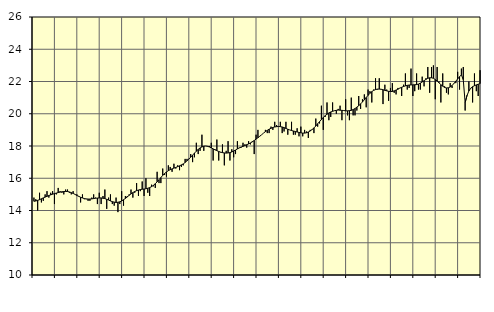
| Category | Piggar | Finansiell verksamhet, företagstjänster, SNI 64-82 |
|---|---|---|
| nan | 14.8 | 14.57 |
| 1.0 | 14.7 | 14.59 |
| 1.0 | 14 | 14.63 |
| 1.0 | 15.1 | 14.67 |
| 1.0 | 14.5 | 14.73 |
| 1.0 | 14.6 | 14.78 |
| 1.0 | 15 | 14.83 |
| 1.0 | 15.2 | 14.88 |
| 1.0 | 14.8 | 14.93 |
| 1.0 | 15.1 | 14.97 |
| 1.0 | 15.2 | 15.01 |
| 1.0 | 14.4 | 15.05 |
| nan | 15 | 15.08 |
| 2.0 | 15.4 | 15.11 |
| 2.0 | 15.2 | 15.14 |
| 2.0 | 15.1 | 15.16 |
| 2.0 | 15 | 15.18 |
| 2.0 | 15.3 | 15.18 |
| 2.0 | 15.3 | 15.18 |
| 2.0 | 15.1 | 15.15 |
| 2.0 | 15 | 15.11 |
| 2.0 | 15.2 | 15.06 |
| 2.0 | 15 | 15 |
| 2.0 | 15 | 14.93 |
| nan | 14.9 | 14.88 |
| 3.0 | 14.5 | 14.82 |
| 3.0 | 15 | 14.78 |
| 3.0 | 14.7 | 14.74 |
| 3.0 | 14.7 | 14.72 |
| 3.0 | 14.6 | 14.71 |
| 3.0 | 14.6 | 14.71 |
| 3.0 | 14.8 | 14.72 |
| 3.0 | 15 | 14.74 |
| 3.0 | 14.8 | 14.76 |
| 3.0 | 14.4 | 14.77 |
| 3.0 | 15.1 | 14.78 |
| nan | 14.4 | 14.78 |
| 4.0 | 14.9 | 14.76 |
| 4.0 | 15.3 | 14.74 |
| 4.0 | 14.1 | 14.69 |
| 4.0 | 14.8 | 14.65 |
| 4.0 | 15 | 14.59 |
| 4.0 | 14.4 | 14.55 |
| 4.0 | 14.3 | 14.52 |
| 4.0 | 14.8 | 14.5 |
| 4.0 | 13.9 | 14.51 |
| 4.0 | 14.4 | 14.54 |
| 4.0 | 15.2 | 14.59 |
| nan | 14.3 | 14.67 |
| 5.0 | 14.9 | 14.75 |
| 5.0 | 14.9 | 14.84 |
| 5.0 | 15 | 14.94 |
| 5.0 | 15.3 | 15.03 |
| 5.0 | 14.8 | 15.11 |
| 5.0 | 15.1 | 15.18 |
| 5.0 | 15.7 | 15.23 |
| 5.0 | 14.9 | 15.27 |
| 5.0 | 15.2 | 15.3 |
| 5.0 | 15.8 | 15.32 |
| 5.0 | 14.9 | 15.33 |
| nan | 16 | 15.35 |
| 6.0 | 15.1 | 15.38 |
| 6.0 | 14.9 | 15.42 |
| 6.0 | 15.6 | 15.48 |
| 6.0 | 15.5 | 15.56 |
| 6.0 | 15.4 | 15.66 |
| 6.0 | 16.4 | 15.78 |
| 6.0 | 15.7 | 15.91 |
| 6.0 | 15.7 | 16.04 |
| 6.0 | 16.6 | 16.18 |
| 6.0 | 16.2 | 16.29 |
| 6.0 | 16.1 | 16.39 |
| nan | 16.8 | 16.47 |
| 7.0 | 16.7 | 16.53 |
| 7.0 | 16.4 | 16.58 |
| 7.0 | 16.9 | 16.63 |
| 7.0 | 16.6 | 16.67 |
| 7.0 | 16.8 | 16.72 |
| 7.0 | 16.5 | 16.77 |
| 7.0 | 16.7 | 16.83 |
| 7.0 | 16.8 | 16.89 |
| 7.0 | 17.2 | 16.98 |
| 7.0 | 17.2 | 17.08 |
| 7.0 | 17.2 | 17.19 |
| nan | 17.5 | 17.31 |
| 8.0 | 17 | 17.43 |
| 8.0 | 17.3 | 17.56 |
| 8.0 | 18.2 | 17.68 |
| 8.0 | 17.5 | 17.79 |
| 8.0 | 17.7 | 17.88 |
| 8.0 | 18.7 | 17.94 |
| 8.0 | 17.7 | 17.99 |
| 8.0 | 18 | 18 |
| 8.0 | 18 | 17.98 |
| 8.0 | 18 | 17.94 |
| 8.0 | 18.2 | 17.89 |
| nan | 17.1 | 17.82 |
| 9.0 | 17.8 | 17.76 |
| 9.0 | 18.4 | 17.71 |
| 9.0 | 17.1 | 17.66 |
| 9.0 | 17.6 | 17.62 |
| 9.0 | 18.1 | 17.59 |
| 9.0 | 16.8 | 17.57 |
| 9.0 | 17.7 | 17.56 |
| 9.0 | 18.3 | 17.57 |
| 9.0 | 17.1 | 17.59 |
| 9.0 | 17.8 | 17.63 |
| 9.0 | 17.3 | 17.69 |
| nan | 17.5 | 17.75 |
| 10.0 | 18.3 | 17.82 |
| 10.0 | 17.9 | 17.88 |
| 10.0 | 17.9 | 17.93 |
| 10.0 | 18.2 | 17.98 |
| 10.0 | 18.1 | 18.03 |
| 10.0 | 17.9 | 18.08 |
| 10.0 | 18.3 | 18.13 |
| 10.0 | 18.1 | 18.19 |
| 10.0 | 18.3 | 18.26 |
| 10.0 | 17.5 | 18.34 |
| 10.0 | 18.7 | 18.43 |
| nan | 19 | 18.51 |
| 11.0 | 18.6 | 18.61 |
| 11.0 | 18.7 | 18.7 |
| 11.0 | 18.8 | 18.8 |
| 11.0 | 19 | 18.89 |
| 11.0 | 18.8 | 18.97 |
| 11.0 | 18.8 | 19.04 |
| 11.0 | 19.2 | 19.1 |
| 11.0 | 19 | 19.15 |
| 11.0 | 19.5 | 19.18 |
| 11.0 | 19.3 | 19.2 |
| 11.0 | 19.2 | 19.21 |
| nan | 19.5 | 19.2 |
| 12.0 | 18.8 | 19.18 |
| 12.0 | 18.9 | 19.14 |
| 12.0 | 19.5 | 19.09 |
| 12.0 | 18.7 | 19.04 |
| 12.0 | 19 | 19 |
| 12.0 | 19.5 | 18.96 |
| 12.0 | 18.7 | 18.93 |
| 12.0 | 18.7 | 18.9 |
| 12.0 | 19.1 | 18.87 |
| 12.0 | 18.6 | 18.84 |
| 12.0 | 19.2 | 18.82 |
| nan | 18.6 | 18.8 |
| 13.0 | 19 | 18.8 |
| 13.0 | 18.9 | 18.82 |
| 13.0 | 18.5 | 18.87 |
| 13.0 | 19 | 18.93 |
| 13.0 | 19 | 19.02 |
| 13.0 | 18.8 | 19.12 |
| 13.0 | 19.7 | 19.24 |
| 13.0 | 19.2 | 19.38 |
| 13.0 | 19.4 | 19.51 |
| 13.0 | 20.5 | 19.64 |
| 13.0 | 19 | 19.77 |
| nan | 19.8 | 19.88 |
| 14.0 | 20.7 | 19.97 |
| 14.0 | 19.6 | 20.05 |
| 14.0 | 19.8 | 20.11 |
| 14.0 | 20.7 | 20.15 |
| 14.0 | 20.2 | 20.19 |
| 14.0 | 20 | 20.21 |
| 14.0 | 20.3 | 20.23 |
| 14.0 | 20.5 | 20.22 |
| 14.0 | 19.6 | 20.21 |
| 14.0 | 20.2 | 20.2 |
| 14.0 | 20.9 | 20.18 |
| nan | 19.9 | 20.18 |
| 15.0 | 19.6 | 20.19 |
| 15.0 | 21 | 20.21 |
| 15.0 | 19.9 | 20.26 |
| 15.0 | 19.9 | 20.32 |
| 15.0 | 20.2 | 20.41 |
| 15.0 | 21.1 | 20.5 |
| 15.0 | 20.3 | 20.61 |
| 15.0 | 20.9 | 20.73 |
| 15.0 | 21.2 | 20.87 |
| 15.0 | 20.4 | 21.01 |
| 15.0 | 21.5 | 21.14 |
| nan | 21.4 | 21.27 |
| 16.0 | 20.7 | 21.37 |
| 16.0 | 21.5 | 21.45 |
| 16.0 | 22.2 | 21.5 |
| 16.0 | 21.5 | 21.53 |
| 16.0 | 22.2 | 21.53 |
| 16.0 | 21.5 | 21.52 |
| 16.0 | 20.6 | 21.49 |
| 16.0 | 21.8 | 21.45 |
| 16.0 | 21.5 | 21.42 |
| 16.0 | 20.8 | 21.39 |
| 16.0 | 21.6 | 21.38 |
| nan | 21.9 | 21.38 |
| 17.0 | 21.3 | 21.42 |
| 17.0 | 21.2 | 21.47 |
| 17.0 | 21.6 | 21.52 |
| 17.0 | 21.6 | 21.59 |
| 17.0 | 21.1 | 21.64 |
| 17.0 | 21.8 | 21.69 |
| 17.0 | 22.5 | 21.73 |
| 17.0 | 21.5 | 21.76 |
| 17.0 | 21.6 | 21.78 |
| 17.0 | 22.8 | 21.79 |
| 17.0 | 21.1 | 21.79 |
| nan | 21.4 | 21.8 |
| 18.0 | 22.5 | 21.81 |
| 18.0 | 21.5 | 21.84 |
| 18.0 | 21.5 | 21.9 |
| 18.0 | 22.3 | 21.97 |
| 18.0 | 21.7 | 22.05 |
| 18.0 | 22.2 | 22.13 |
| 18.0 | 22.9 | 22.2 |
| 18.0 | 21.3 | 22.23 |
| 18.0 | 22.9 | 22.23 |
| 18.0 | 23 | 22.2 |
| 18.0 | 20.9 | 22.12 |
| nan | 22.9 | 22.03 |
| 19.0 | 22 | 21.92 |
| 19.0 | 20.7 | 21.8 |
| 19.0 | 22.5 | 21.71 |
| 19.0 | 21.7 | 21.63 |
| 19.0 | 21.3 | 21.6 |
| 19.0 | 21.2 | 21.61 |
| 19.0 | 21.9 | 21.66 |
| 19.0 | 21.6 | 21.75 |
| 19.0 | 21.9 | 21.88 |
| 19.0 | 21.9 | 22.02 |
| 19.0 | 22.6 | 22.16 |
| nan | 21.5 | 22.3 |
| 20.0 | 22.8 | 22.41 |
| 20.0 | 22.9 | 22.11 |
| 20.0 | 20.2 | 20.69 |
| 20.0 | 21.1 | 21.13 |
| 20.0 | 22 | 21.41 |
| 20.0 | 21.6 | 21.58 |
| 20.0 | 20.7 | 21.68 |
| 20.0 | 22.5 | 21.74 |
| 20.0 | 21.4 | 21.79 |
| 20.0 | 21.1 | 21.83 |
| 20.0 | 22.7 | 21.87 |